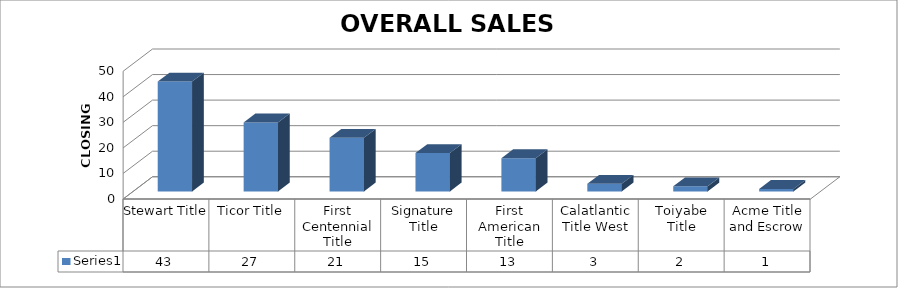
| Category | Series 0 |
|---|---|
| Stewart Title | 43 |
| Ticor Title | 27 |
| First Centennial Title | 21 |
| Signature Title | 15 |
| First American Title | 13 |
| Calatlantic Title West | 3 |
| Toiyabe Title | 2 |
| Acme Title and Escrow | 1 |